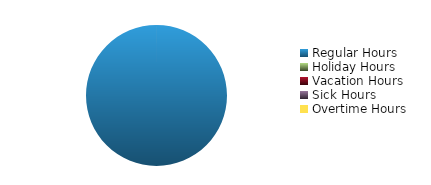
| Category | Series 0 | Series 1 |
|---|---|---|
| Regular Hours | 64 |  |
| Holiday Hours | 0 |  |
| Vacation Hours | 0 |  |
| Sick Hours | 0 |  |
| Overtime Hours | 0 |  |